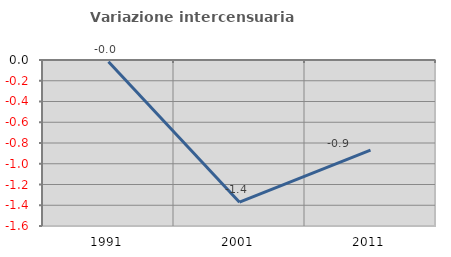
| Category | Variazione intercensuaria annua |
|---|---|
| 1991.0 | -0.016 |
| 2001.0 | -1.371 |
| 2011.0 | -0.869 |